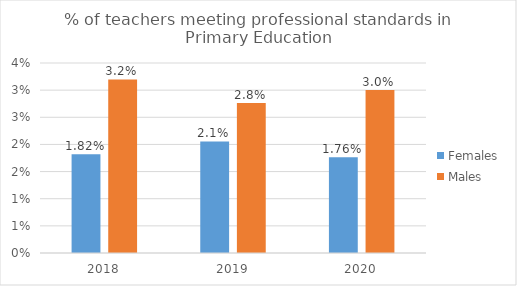
| Category | Females | Males |
|---|---|---|
| 2018.0 | 0.018 | 0.032 |
| 2019.0 | 0.021 | 0.028 |
| 2020.0 | 0.018 | 0.03 |